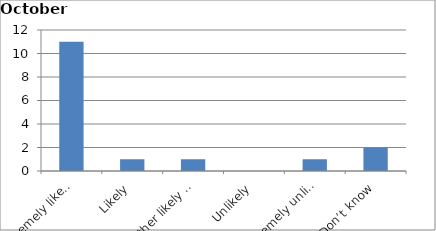
| Category | Series 0 |
|---|---|
| Extremely likely | 11 |
| Likely | 1 |
| Neither likely nor unlikely | 1 |
| Unlikely | 0 |
| Extremely unlikely | 1 |
| Don’t know | 2 |